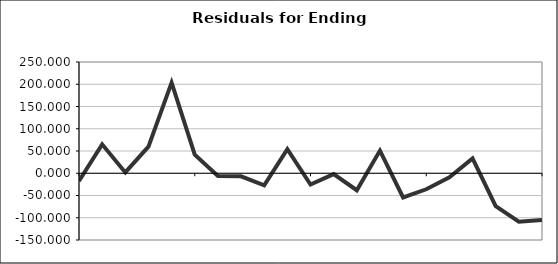
| Category | Series 0 |
|---|---|
| 0 | -17.472 |
| 1 | 64.982 |
| 2 | 1.896 |
| 3 | 59.893 |
| 4 | 203.609 |
| 5 | 41.902 |
| 6 | -6.38 |
| 7 | -6.982 |
| 8 | -26.983 |
| 9 | 53.944 |
| 10 | -25.318 |
| 11 | -1.979 |
| 12 | -38.2 |
| 13 | 50.895 |
| 14 | -54.346 |
| 15 | -35.994 |
| 16 | -9.302 |
| 17 | 33.361 |
| 18 | -73.748 |
| 19 | -108.899 |
| 20 | -104.881 |